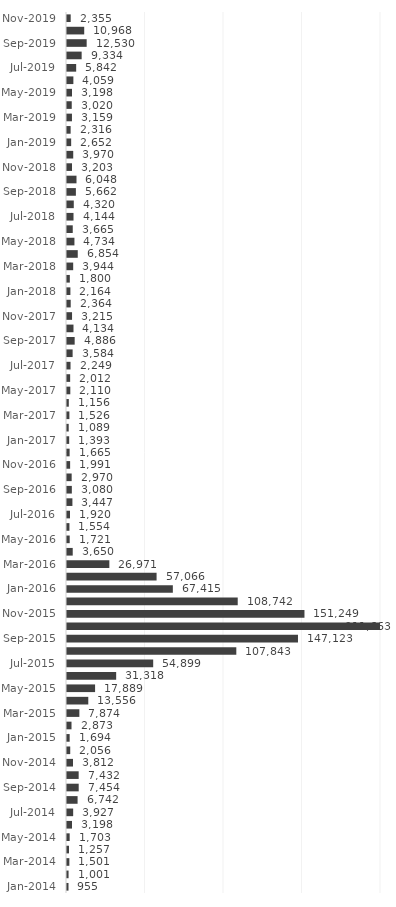
| Category | Series 0 |
|---|---|
| Jan-2014 | 955 |
| Feb-2014 | 1001 |
| Mar-2014 | 1501 |
| Apr-2014 | 1257 |
| May-2014 | 1703 |
| Jun-2014 | 3198 |
| Jul-2014 | 3927 |
| Aug-2014 | 6742 |
| Sep-2014 | 7454 |
| Oct-2014 | 7432 |
| Nov-2014 | 3812 |
| Dec-2014 | 2056 |
| Jan-2015 | 1694 |
| Feb-2015 | 2873 |
| Mar-2015 | 7874 |
| Apr-2015 | 13556 |
| May-2015 | 17889 |
| Jun-2015 | 31318 |
| Jul-2015 | 54899 |
| Aug-2015 | 107843 |
| Sep-2015 | 147123 |
| Oct-2015 | 211663 |
| Nov-2015 | 151249 |
| Dec-2015 | 108742 |
| Jan-2016 | 67415 |
| Feb-2016 | 57066 |
| Mar-2016 | 26971 |
| Apr-2016 | 3650 |
| May-2016 | 1721 |
| Jun-2016 | 1554 |
| Jul-2016 | 1920 |
| Aug-2016 | 3447 |
| Sep-2016 | 3080 |
| Oct-2016 | 2970 |
| Nov-2016 | 1991 |
| Dec-2016 | 1665 |
| Jan-2017 | 1393 |
| Feb-2017 | 1089 |
| Mar-2017 | 1526 |
| Apr-2017 | 1156 |
| May-2017 | 2110 |
| Jun-2017 | 2012 |
| Jul-2017 | 2249 |
| Aug-2017 | 3584 |
| Sep-2017 | 4886 |
| Oct-2017 | 4134 |
| Nov-2017 | 3215 |
| Dec-2017 | 2364 |
| Jan-2018 | 2164 |
| Feb-2018 | 1800 |
| Mar-2018 | 3944 |
| Apr-2018 | 6854 |
| May-2018 | 4734 |
| Jun-2018 | 3665 |
| Jul-2018 | 4144 |
| Aug-2018 | 4320 |
| Sep-2018 | 5662 |
| Oct-2018 | 6048 |
| Nov-2018 | 3203 |
| Dec-2018 | 3970 |
| Jan-2019 | 2652 |
| Feb-2019 | 2316 |
| Mar-2019 | 3159 |
| Apr-2019 | 3020 |
| May-2019 | 3198 |
| Jun-2019 | 4059 |
| Jul-2019 | 5842 |
| Aug-2019 | 9334 |
| Sep-2019 | 12530 |
| Oct-2019 | 10968 |
| Nov-2019 | 2355 |